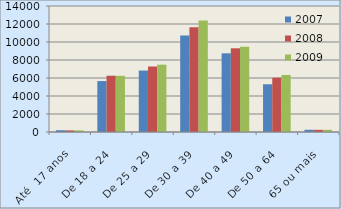
| Category | 2007 | 2008 | 2009 |
|---|---|---|---|
| Até  17 anos | 199 | 180 | 186 |
| De 18 a 24 | 5658 | 6252 | 6244 |
| De 25 a 29 | 6828 | 7275 | 7481 |
| De 30 a 39 | 10721 | 11638 | 12386 |
| De 40 a 49 | 8745 | 9302 | 9469 |
| De 50 a 64 | 5303 | 6031 | 6333 |
| 65 ou mais | 251 | 242 | 245 |